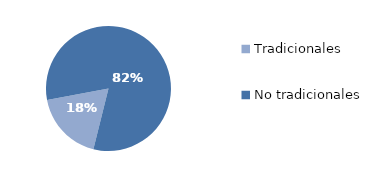
| Category | Series 0 |
|---|---|
| Tradicionales | 588.518 |
| No tradicionales | 2649.379 |